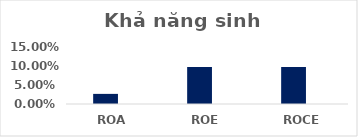
| Category | Series 0 | Series 1 | Series 2 | Series 3 |
|---|---|---|---|---|
| ROA | 0.027 |  |  |  |
| ROE | 0.097 |  |  |  |
| ROCE | 0.097 |  |  |  |